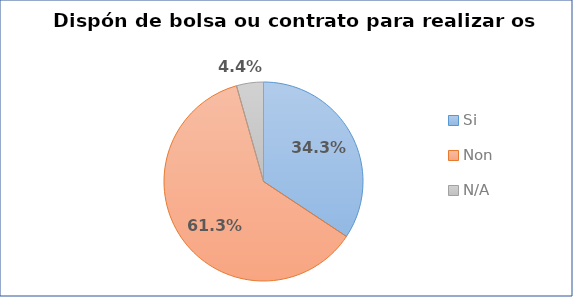
| Category | Dispón de bolsa ou contrato para realizar os estudos? |
|---|---|
| Si | 0.343 |
| Non | 0.613 |
| N/A | 0.044 |